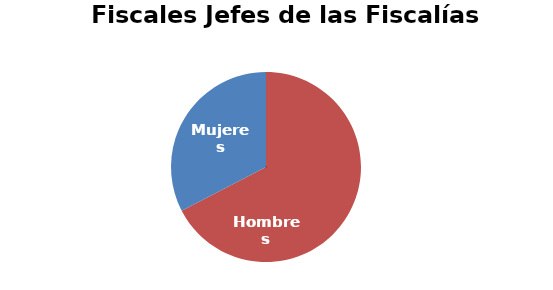
| Category | Fiscales Jefes de las Fiscalías Provinciales |
|---|---|
| Hombres | 31 |
| Mujeres | 15 |